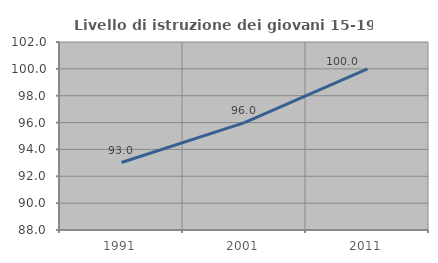
| Category | Livello di istruzione dei giovani 15-19 anni |
|---|---|
| 1991.0 | 93.023 |
| 2001.0 | 96 |
| 2011.0 | 100 |